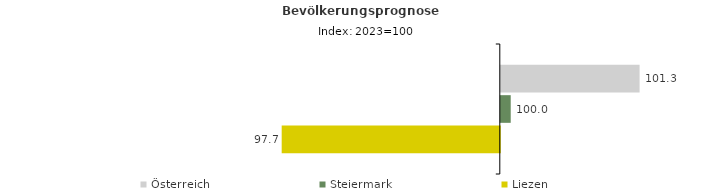
| Category | Österreich | Steiermark | Liezen |
|---|---|---|---|
| 2023.0 | 101.3 | 100 | 97.7 |